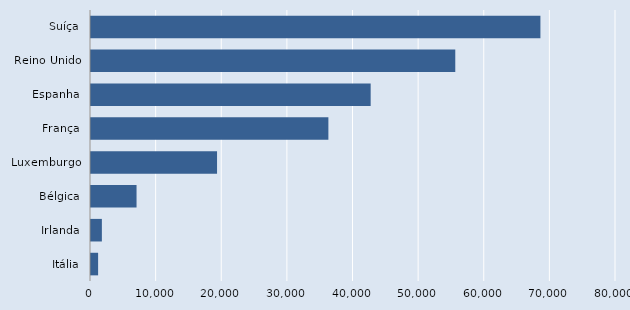
| Category | Series 0 |
|---|---|
| Suíça | 68483 |
| Reino Unido | 55509 |
| Espanha | 42616 |
| França | 36173 |
| Luxemburgo | 19207 |
| Bélgica | 6940 |
| Irlanda | 1656 |
| Itália | 1083 |